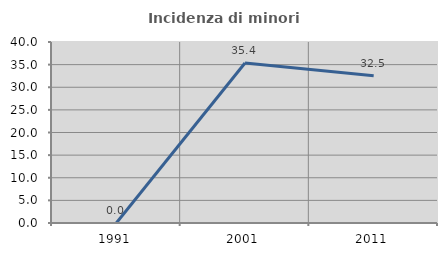
| Category | Incidenza di minori stranieri |
|---|---|
| 1991.0 | 0 |
| 2001.0 | 35.354 |
| 2011.0 | 32.537 |